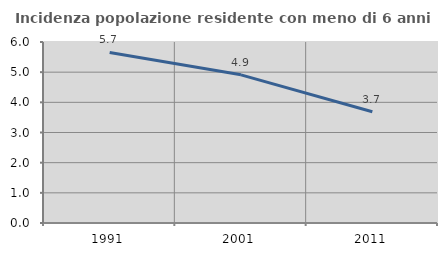
| Category | Incidenza popolazione residente con meno di 6 anni |
|---|---|
| 1991.0 | 5.654 |
| 2001.0 | 4.912 |
| 2011.0 | 3.688 |